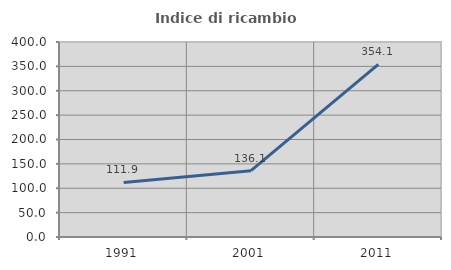
| Category | Indice di ricambio occupazionale  |
|---|---|
| 1991.0 | 111.939 |
| 2001.0 | 136.111 |
| 2011.0 | 354.118 |